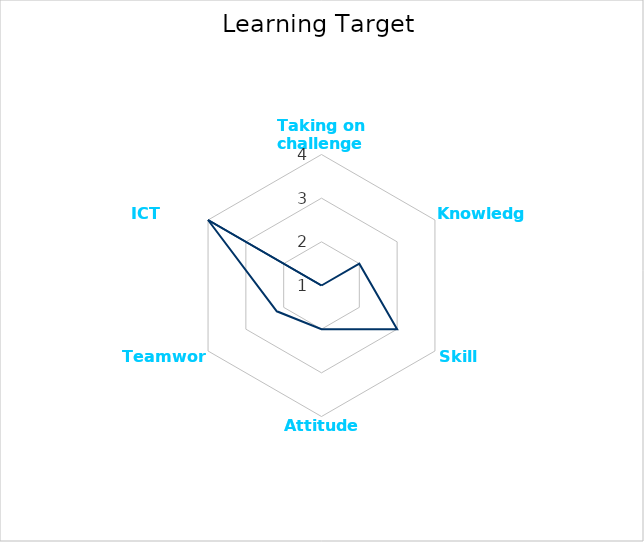
| Category | Average |
|---|---|
| Taking on challenges | 1 |
| Knowledge | 2 |
| Skills | 3 |
| Attitudes | 2 |
| Teamwork | 2.182 |
| ICT proficiency | 4 |